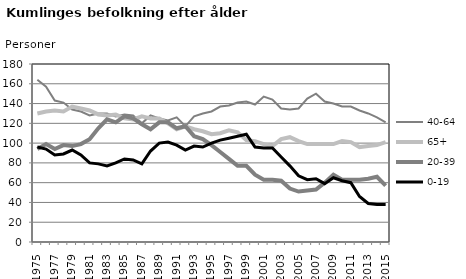
| Category | 40-64 | 65+ | 20-39 | 0-19 |
|---|---|---|---|---|
| 1975.0 | 164 | 130 | 94 | 96 |
| 1976.0 | 157 | 132 | 99 | 94 |
| 1977.0 | 143 | 133 | 94 | 88 |
| 1978.0 | 141 | 132 | 98 | 89 |
| 1979.0 | 134 | 137 | 97 | 93 |
| 1980.0 | 132 | 135 | 99 | 88 |
| 1981.0 | 128 | 133 | 104 | 80 |
| 1982.0 | 130 | 129 | 115 | 79 |
| 1983.0 | 130 | 128 | 124 | 77 |
| 1984.0 | 127 | 129 | 121 | 80 |
| 1985.0 | 129 | 125 | 127 | 84 |
| 1986.0 | 128 | 124 | 125 | 83 |
| 1987.0 | 120 | 127 | 119 | 79 |
| 1988.0 | 128 | 125 | 114 | 92 |
| 1989.0 | 125 | 125 | 121 | 100 |
| 1990.0 | 123 | 120 | 121 | 101 |
| 1991.0 | 126 | 114 | 115 | 98 |
| 1992.0 | 117 | 117 | 117 | 93 |
| 1993.0 | 127 | 114 | 107 | 97 |
| 1994.0 | 130 | 112 | 104 | 96 |
| 1995.0 | 132 | 109 | 98 | 100 |
| 1996.0 | 137 | 110 | 91 | 103 |
| 1997.0 | 138 | 113 | 84 | 105 |
| 1998.0 | 141 | 111 | 77 | 107 |
| 1999.0 | 142 | 103 | 77 | 109 |
| 2000.0 | 139 | 102 | 68 | 96 |
| 2001.0 | 147 | 99 | 63 | 95 |
| 2002.0 | 144 | 97 | 63 | 95 |
| 2003.0 | 135 | 104 | 62 | 86 |
| 2004.0 | 134 | 106 | 54 | 77 |
| 2005.0 | 135 | 102 | 51 | 67 |
| 2006.0 | 145 | 99 | 52 | 63 |
| 2007.0 | 150 | 99 | 53 | 64 |
| 2008.0 | 142 | 99 | 60 | 59 |
| 2009.0 | 140 | 99 | 68 | 65 |
| 2010.0 | 137 | 102 | 63 | 62 |
| 2011.0 | 137 | 101 | 63 | 60 |
| 2012.0 | 133 | 96 | 63 | 46 |
| 2013.0 | 130 | 97 | 64 | 39 |
| 2014.0 | 126 | 98 | 66 | 38 |
| 2015.0 | 121 | 101 | 57 | 38 |